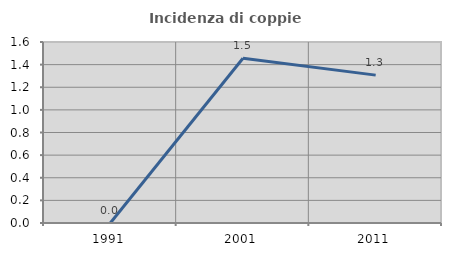
| Category | Incidenza di coppie miste |
|---|---|
| 1991.0 | 0 |
| 2001.0 | 1.456 |
| 2011.0 | 1.307 |